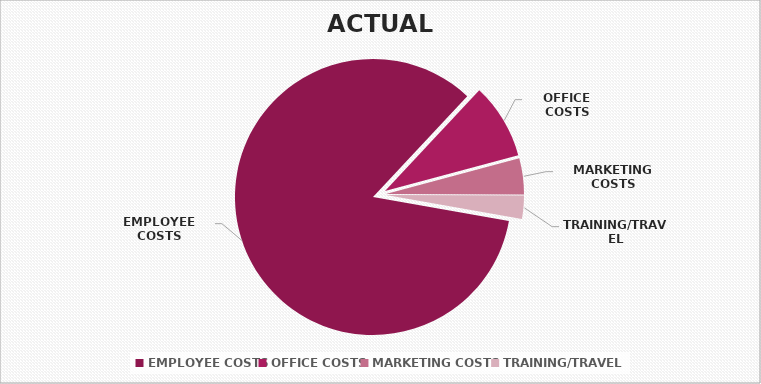
| Category | Series 0 |
|---|---|
| EMPLOYEE COSTS | 659130 |
| OFFICE COSTS | 69350 |
| MARKETING COSTS | 33159 |
| TRAINING/TRAVEL | 21300 |